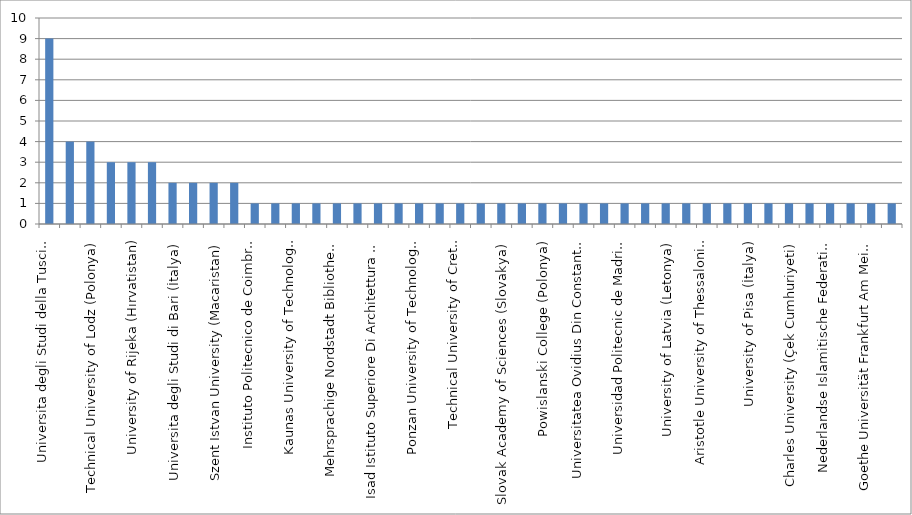
| Category | Series 0 |
|---|---|
| Universita degli Studi della Tuscia (İtalya) | 9 |
| University of Thessaly (Yunanistan) | 4 |
| Technical University of Lodz (Polonya) | 4 |
| Instituto Politecnico de Leiria (Portekiz) | 3 |
| University of Rijeka (Hırvatistan) | 3 |
| Matej Bel University (Slovakya) | 3 |
| Universita degli Studi di Bari (İtalya) | 2 |
| University of Ljubljana (Slovenya) | 2 |
| Szent Istvan University (Macaristan) | 2 |
| Esterhazy Karoly College (Macaristan) | 2 |
| Instituto Politecnico de Coimbra (Portekiz) | 1 |
| University of Food Technologies (Bulgaristan) | 1 |
| Kaunas University of Technology (Litvanya) | 1 |
| Consiglio Nazionale delle Ricerche - Bari (İtalya) | 1 |
| Mehrsprachige Nordstadt Bibliothek (Almanya) | 1 |
| Max Rubner-Institut, Federal Research Institute for Nutrition and Food (Almanya) | 1 |
| Isad Istituto Superiore Di Architettura E Design (İtalya) | 1 |
| Panevezio Kolegija (Litvanya) | 1 |
| Ponzan University of Technology (Polonya)  | 1 |
| University of Passau (Almanya) | 1 |
| Technical University of Crete (Yunanistan) | 1 |
| Agricultural University – Plovdiv (Bulgaristan) | 1 |
| Slovak Academy of Sciences (Slovakya) | 1 |
| Prof. Dr. Assen Zlatarov University (Bulgaristan) | 1 |
| Powislanski College (Polonya) | 1 |
| Konstantin Preslavsky University of Shumen (Bulgaristan) | 1 |
| Universitatea Ovidius Din Constanta (Romanya) | 1 |
| Institut National des Langues et Civilisations Orientales (INALCO) (Fransa) | 1 |
| Universidad Politecnic de Madrid (İspanya) | 1 |
| AGH University of Science and Technology (Polonya) | 1 |
| University of Latvia (Letonya) | 1 |
| Universite de Nice Sophia Antipolis (Fransa) | 1 |
| Aristotle University of Thessaloniki (Yunanistan) | 1 |
| Vytautas Magnus University (Litvanya) | 1 |
| University of Pisa (İtalya) | 1 |
| Universita degli Studi di Salerno (İtalya) | 1 |
| Charles University (Çek Cumhuriyeti) | 1 |
| Julius-Maximilians Universitat Würzburg (Almanya) | 1 |
| Nederlandse Islamitische Federatie (Hollanda) | 1 |
| Transilvania University of Brasov (Romanya) | 1 |
| Goethe Universität Frankfurt Am Mein (Almanya) | 1 |
| Technologiko Ekpaideftiko Idryma - Pirea T.E.I. (Yunanistan) | 1 |